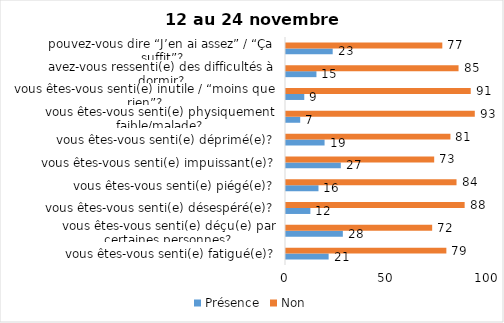
| Category | Présence | Non |
|---|---|---|
| vous êtes-vous senti(e) fatigué(e)? | 21 | 79 |
| vous êtes-vous senti(e) déçu(e) par certaines personnes? | 28 | 72 |
| vous êtes-vous senti(e) désespéré(e)? | 12 | 88 |
| vous êtes-vous senti(e) piégé(e)? | 16 | 84 |
| vous êtes-vous senti(e) impuissant(e)? | 27 | 73 |
| vous êtes-vous senti(e) déprimé(e)? | 19 | 81 |
| vous êtes-vous senti(e) physiquement faible/malade? | 7 | 93 |
| vous êtes-vous senti(e) inutile / “moins que rien”? | 9 | 91 |
| avez-vous ressenti(e) des difficultés à dormir? | 15 | 85 |
| pouvez-vous dire “J’en ai assez” / “Ça suffit”? | 23 | 77 |